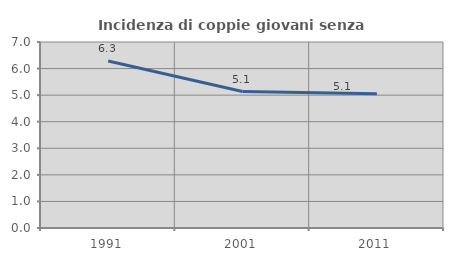
| Category | Incidenza di coppie giovani senza figli |
|---|---|
| 1991.0 | 6.282 |
| 2001.0 | 5.134 |
| 2011.0 | 5.051 |